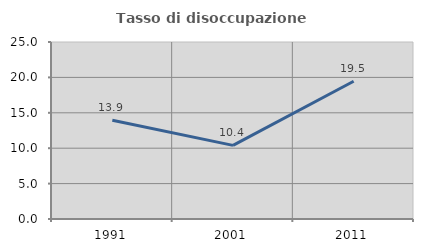
| Category | Tasso di disoccupazione giovanile  |
|---|---|
| 1991.0 | 13.937 |
| 2001.0 | 10.402 |
| 2011.0 | 19.461 |